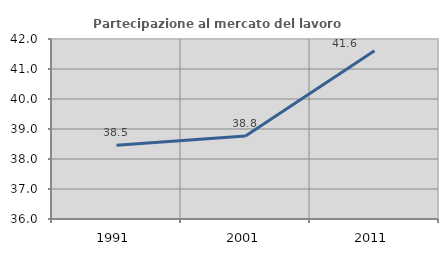
| Category | Partecipazione al mercato del lavoro  femminile |
|---|---|
| 1991.0 | 38.462 |
| 2001.0 | 38.771 |
| 2011.0 | 41.606 |